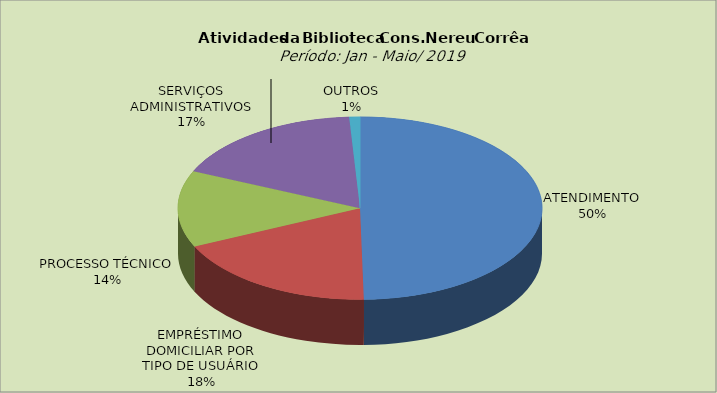
| Category | Series 0 |
|---|---|
| ATENDIMENTO | 49.668 |
| EMPRÉSTIMO DOMICILIAR POR TIPO DE USUÁRIO | 18.441 |
| PROCESSO TÉCNICO | 13.534 |
| SERVIÇOS ADMINISTRATIVOS | 17.406 |
| OUTROS | 0.951 |